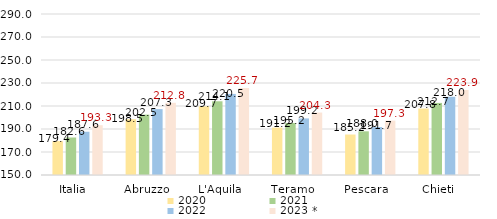
| Category | 2020   | 2021   | 2022   | 2023 *   |
|---|---|---|---|---|
| Italia   | 179.4 | 182.6 | 187.6 | 193.3 |
| Abruzzo   | 198.5 | 202.5 | 207.3 | 212.8 |
| L'Aquila   | 209.7 | 214.1 | 220.5 | 225.7 |
| Teramo   | 191.2 | 195.2 | 199.2 | 204.3 |
| Pescara   | 185.2 | 188 | 191.7 | 197.3 |
| Chieti   | 207.8 | 212.7 | 218 | 223.9 |